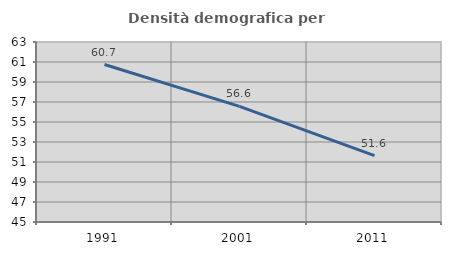
| Category | Densità demografica |
|---|---|
| 1991.0 | 60.745 |
| 2001.0 | 56.567 |
| 2011.0 | 51.637 |